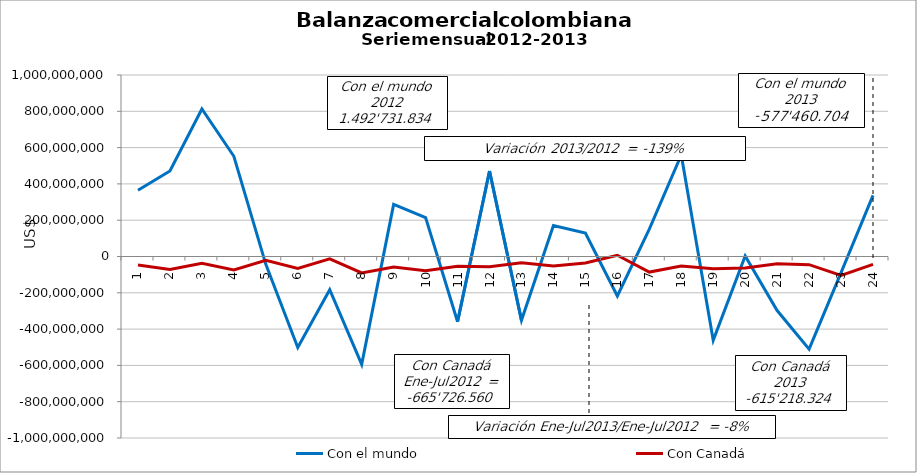
| Category | Con el mundo | Con Canadá |
|---|---|---|
| 0 | 365236896.39 | -47301664.71 |
| 1 | 471254376.48 | -71802871.41 |
| 2 | 812672155.33 | -36721224.95 |
| 3 | 552212453.87 | -73904272.89 |
| 4 | -43303050.56 | -20507835.32 |
| 5 | -501300545.37 | -65757400.66 |
| 6 | -182769268.25 | -13426369.24 |
| 7 | -594402576.84 | -90434175.27 |
| 8 | 287007192.43 | -57464488.24 |
| 9 | 214327872.41 | -79109021.33 |
| 10 | -359526323.33 | -53195836.08 |
| 11 | 471322651.54 | -56101399.6 |
| 12 | -351699235.93 | -34604655.44 |
| 13 | 170276250.68 | -51650946.92 |
| 14 | 129706117.85 | -35238056.14 |
| 15 | -217650665.27 | 7008646.3 |
| 16 | 151125826.62 | -85932640.61 |
| 17 | 559734024.39 | -52417950.7 |
| 18 | -461846719.93 | -67012524.2 |
| 19 | 2846253 | -63351800 |
| 20 | -297689547 | -39886589 |
| 21 | -510240160 | -45068226 |
| 22 | -88962805 | -104129360 |
| 23 | 336939957 | -42934221 |